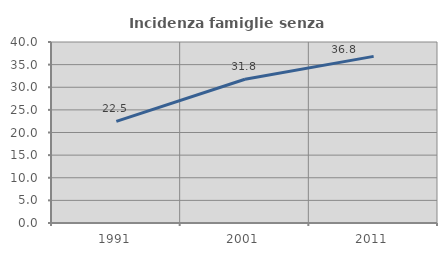
| Category | Incidenza famiglie senza nuclei |
|---|---|
| 1991.0 | 22.458 |
| 2001.0 | 31.76 |
| 2011.0 | 36.82 |